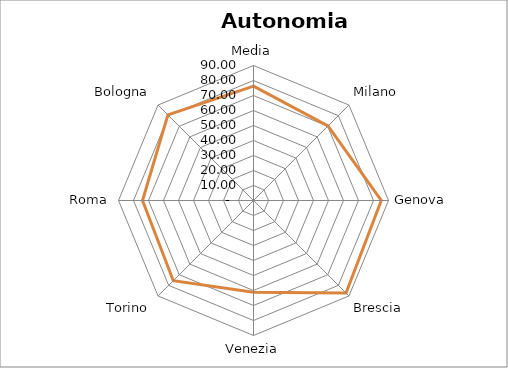
| Category | Autonomia finanziaria |
|---|---|
| Media | 76.294 |
| Milano | 70.24 |
| Genova | 85.18 |
| Brescia | 87.25 |
| Venezia | 61.1 |
| Torino | 75.59 |
| Roma | 73.99 |
| Bologna | 80.71 |